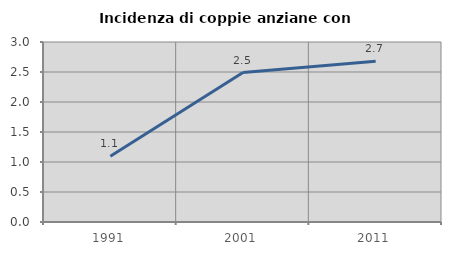
| Category | Incidenza di coppie anziane con figli |
|---|---|
| 1991.0 | 1.094 |
| 2001.0 | 2.491 |
| 2011.0 | 2.679 |